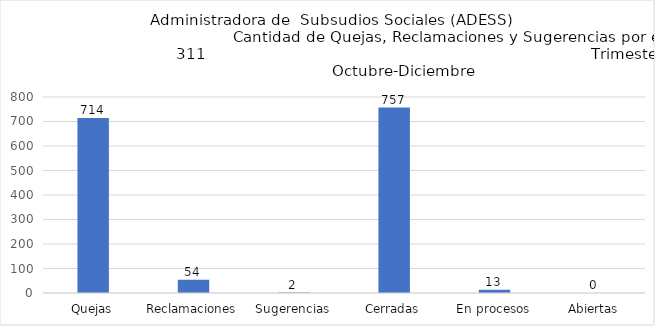
| Category | Series 0 |
|---|---|
| Quejas | 714 |
| Reclamaciones | 54 |
| Sugerencias | 2 |
| Cerradas | 757 |
| En procesos | 13 |
| Abiertas | 0 |